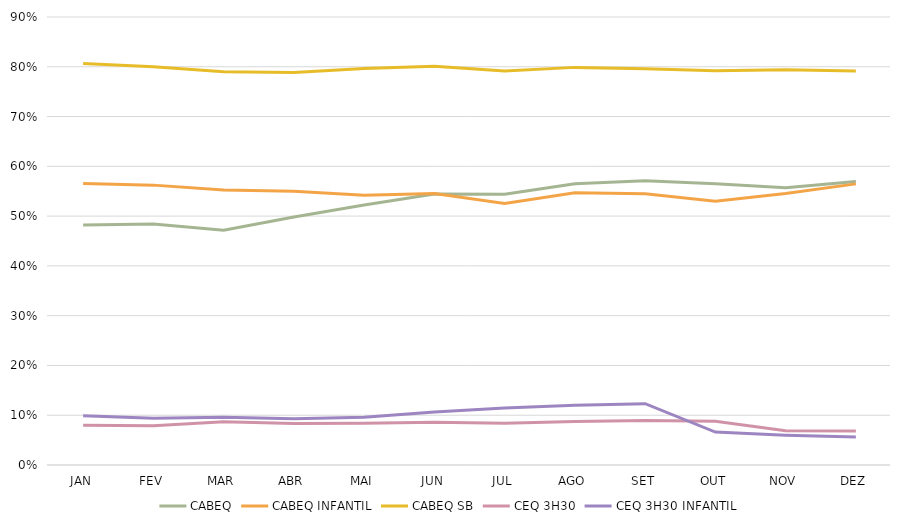
| Category | CABEQ | CABEQ INFANTIL | CABEQ SB | CEQ 3H30 | CEQ 3H30 INFANTIL |
|---|---|---|---|---|---|
| JAN | 0.482 | 0.566 | 0.807 | 0.08 | 0.099 |
| FEV | 0.484 | 0.562 | 0.8 | 0.079 | 0.094 |
| MAR | 0.472 | 0.552 | 0.79 | 0.087 | 0.096 |
| ABR | 0.498 | 0.55 | 0.788 | 0.083 | 0.093 |
| MAI | 0.522 | 0.542 | 0.797 | 0.084 | 0.096 |
| JUN | 0.544 | 0.545 | 0.801 | 0.086 | 0.107 |
| JUL | 0.544 | 0.525 | 0.792 | 0.084 | 0.115 |
| AGO | 0.565 | 0.547 | 0.799 | 0.087 | 0.12 |
| SET | 0.571 | 0.545 | 0.796 | 0.089 | 0.123 |
| OUT | 0.565 | 0.53 | 0.792 | 0.088 | 0.066 |
| NOV | 0.557 | 0.545 | 0.794 | 0.069 | 0.06 |
| DEZ | 0.569 | 0.565 | 0.791 | 0.068 | 0.056 |